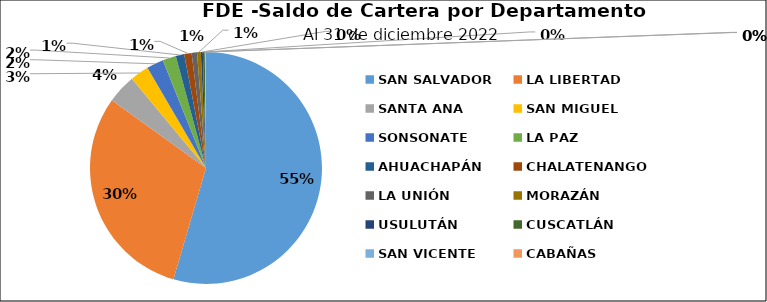
| Category | Saldo | Créditos |
|---|---|---|
| SAN SALVADOR | 28.736 | 370 |
| LA LIBERTAD | 16.021 | 153 |
| SANTA ANA | 2.134 | 36 |
| SAN MIGUEL | 1.37 | 65 |
| SONSONATE | 1.243 | 28 |
| LA PAZ | 0.984 | 48 |
| AHUACHAPÁN | 0.619 | 12 |
| CHALATENANGO | 0.546 | 16 |
| LA UNIÓN | 0.393 | 26 |
| MORAZÁN | 0.277 | 15 |
| USULUTÁN | 0.147 | 14 |
| CUSCATLÁN | 0.142 | 20 |
| SAN VICENTE | 0.045 | 4 |
| CABAÑAS | 0.042 | 5 |